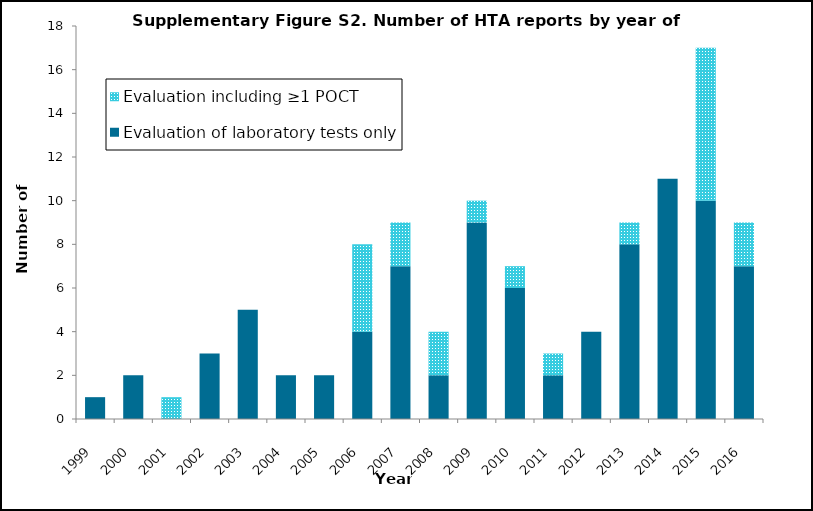
| Category | Evaluation of laboratory tests only | Evaluation including ≥1 POCT |
|---|---|---|
| 1999.0 | 1 | 0 |
| 2000.0 | 2 | 0 |
| 2001.0 | 0 | 1 |
| 2002.0 | 3 | 0 |
| 2003.0 | 5 | 0 |
| 2004.0 | 2 | 0 |
| 2005.0 | 2 | 0 |
| 2006.0 | 4 | 4 |
| 2007.0 | 7 | 2 |
| 2008.0 | 2 | 2 |
| 2009.0 | 9 | 1 |
| 2010.0 | 6 | 1 |
| 2011.0 | 2 | 1 |
| 2012.0 | 4 | 0 |
| 2013.0 | 8 | 1 |
| 2014.0 | 11 | 0 |
| 2015.0 | 10 | 7 |
| 2016.0 | 7 | 2 |